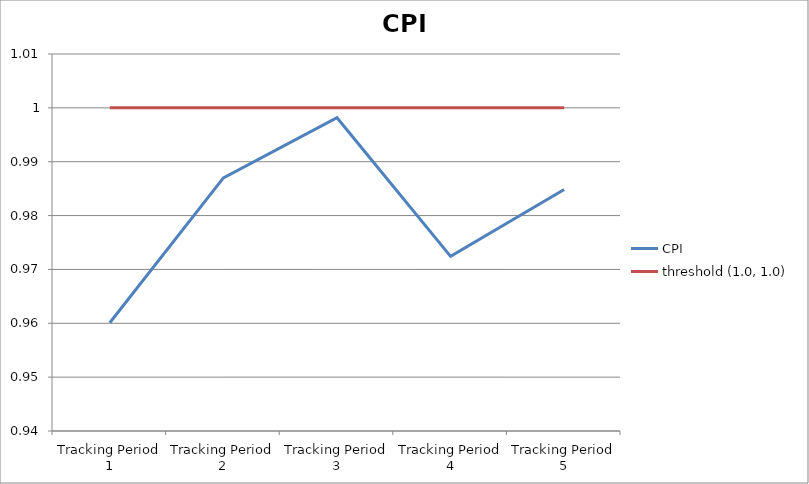
| Category | CPI | threshold (1.0, 1.0) |
|---|---|---|
| Tracking Period 1 | 0.96 | 1 |
| Tracking Period 2 | 0.987 | 1 |
| Tracking Period 3 | 0.998 | 1 |
| Tracking Period 4 | 0.972 | 1 |
| Tracking Period 5 | 0.985 | 1 |